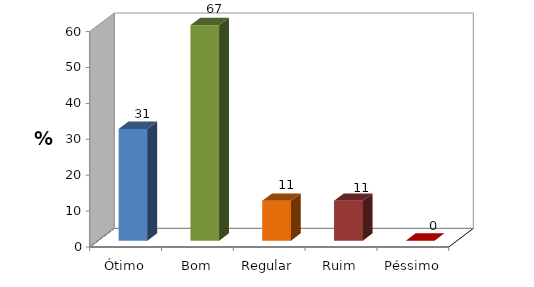
| Category | Series 0 |
|---|---|
| Ótimo | 31.111 |
| Bom | 66.667 |
| Regular | 11.111 |
| Ruim | 11.111 |
| Péssimo | 0 |